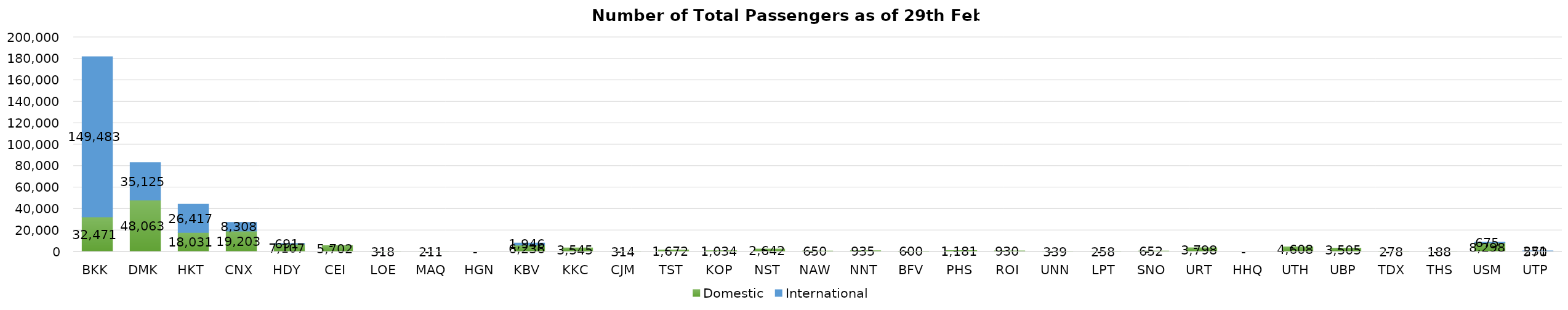
| Category | Domestic | International |
|---|---|---|
| BKK | 32471 | 149483 |
| DMK | 48063 | 35125 |
| HKT | 18031 | 26417 |
| CNX | 19203 | 8308 |
| HDY | 7107 | 691 |
| CEI | 5702 | 0 |
| LOE | 318 | 0 |
| MAQ | 211 | 0 |
| HGN | 0 | 0 |
| KBV | 6236 | 1946 |
| KKC | 3545 | 0 |
| CJM | 314 | 0 |
| TST | 1672 | 0 |
| KOP | 1034 | 0 |
| NST | 2642 | 0 |
| NAW | 650 | 0 |
| NNT | 935 | 0 |
| BFV | 600 | 0 |
| PHS | 1181 | 0 |
| ROI | 930 | 0 |
| UNN | 339 | 0 |
| LPT | 258 | 0 |
| SNO | 652 | 0 |
| URT | 3798 | 0 |
| HHQ | 0 | 0 |
| UTH | 4608 | 0 |
| UBP | 3505 | 0 |
| TDX | 278 | 0 |
| THS | 188 | 0 |
| USM | 8298 | 675 |
| UTP | 570 | 251 |